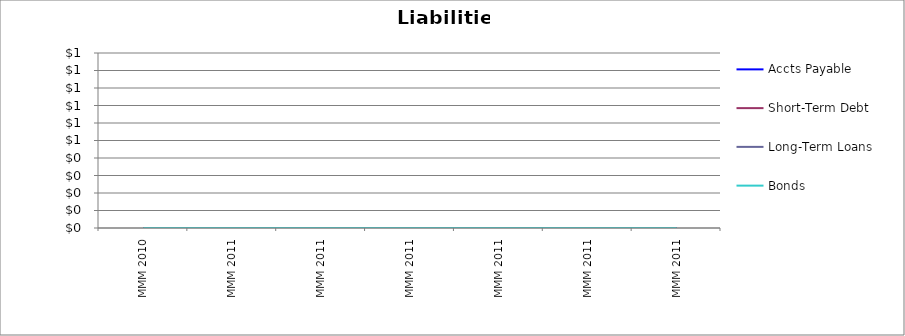
| Category | Accts Payable | Short-Term Debt | Long-Term Loans | Bonds |
|---|---|---|---|---|
| MMM 2010 | 0 | 0 | 0 | 0 |
| MMM 2011 | 0 | 0 | 0 | 0 |
| MMM 2011 | 0 | 0 | 0 | 0 |
| MMM 2011 | 0 | 0 | 0 | 0 |
| MMM 2011 | 0 | 0 | 0 | 0 |
| MMM 2011 | 0 | 0 | 0 | 0 |
| MMM 2011 | 0 | 0 | 0 | 0 |